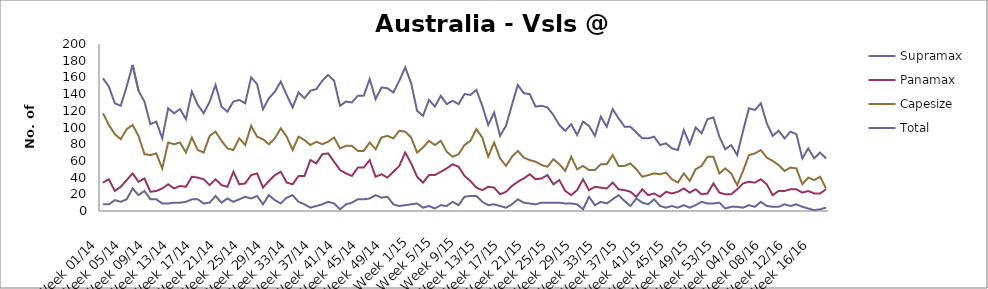
| Category | Supramax | Panamax | Capesize | Total |
|---|---|---|---|---|
| Week 01/14 | 8 | 34 | 117 | 159 |
| Week 02/14 | 8 | 38 | 103 | 149 |
| Week 03/14 | 13 | 24 | 92 | 129 |
| Week 04/14 | 11 | 29 | 86 | 126 |
| Week 05/14 | 14 | 37 | 98 | 149 |
| Week 06/14 | 27 | 45 | 103 | 175 |
| Week 07/14 | 19 | 35 | 90 | 144 |
| Week 08/14 | 24 | 39 | 68 | 131 |
| Week 09/14 | 14 | 23 | 67 | 104 |
| Week 10/14 | 14 | 24 | 69 | 107 |
| Week 11/14 | 9 | 27 | 51 | 87 |
| Week 12/14 | 9 | 32 | 82 | 123 |
| Week 13/14 | 10 | 27 | 80 | 117 |
| Week 14/14 | 10 | 30 | 82 | 122 |
| Week 15/14 | 11 | 29 | 70 | 110 |
| Week 16/14 | 14 | 41 | 88 | 143 |
| Week 17/14 | 14 | 40 | 73 | 127 |
| Week 18/14 | 9 | 38 | 70 | 117 |
| Week 19/14 | 10 | 31 | 90 | 131 |
| Week 20/14 | 18 | 38 | 95 | 151 |
| Week 21/14 | 10 | 31 | 84 | 125 |
| Week 22/14 | 15 | 29 | 75 | 119 |
| Week 23/14 | 11 | 47 | 73 | 131 |
| Week 24/14 | 14 | 32 | 87 | 133 |
| Week 25/14 | 17 | 33 | 79 | 129 |
| Week 26/14 | 15 | 43 | 102 | 160 |
| Week 27/14 | 18 | 45 | 89 | 152 |
| Week 28/14 | 8 | 28 | 86 | 122 |
| Week 29/14 | 19 | 36 | 80 | 135 |
| Week 30/14 | 13 | 43 | 87 | 143 |
| Week 31/14 | 9 | 47 | 99 | 155 |
| Week 32/14 | 16 | 34 | 89 | 139 |
| Week 33/14 | 19 | 32 | 73 | 124 |
| Week 34/14 | 11 | 42 | 89 | 142 |
| Week 35/14 | 8 | 42 | 85 | 135 |
| Week 36/14 | 4 | 61 | 79 | 144 |
| Week 37/14 | 6 | 57 | 83 | 146 |
| Week 38/14 | 8 | 68 | 80 | 156 |
| Week 39/14 | 11 | 69 | 83 | 163 |
| Week 40/14 | 9 | 59 | 88 | 156 |
| Week 41/14 | 2 | 49 | 75 | 126 |
| Week 42/14 | 8 | 45 | 78 | 131 |
| Week 43/14 | 10 | 42 | 78 | 130 |
| Week 44/14 | 14 | 52 | 72 | 138 |
| Week 45/14 | 14 | 52 | 72 | 138 |
| Week 46/14 | 15 | 61 | 82 | 158 |
| Week 47/14 | 19 | 41 | 74 | 134 |
| Week 48/14 | 16 | 44 | 88 | 148 |
| Week 49/14 | 17 | 40 | 90 | 147 |
| Week 50/14 | 8 | 47 | 87 | 142 |
| Week 51/14 | 6 | 54 | 96 | 156 |
| Week 52/14 | 7 | 70 | 95 | 172 |
| Week 1/15 | 8 | 57 | 88 | 153 |
| Week 2/15 | 9 | 41 | 70 | 120 |
| Week 3/15 | 4 | 34 | 76 | 114 |
| Week 4/15 | 6 | 43 | 84 | 133 |
| Week 5/15 | 3 | 43 | 79 | 125 |
| Week 6/15 | 7 | 47 | 84 | 138 |
| Week 7/15 | 6 | 51 | 71 | 128 |
| Week 8/15 | 11 | 56 | 65 | 132 |
| Week 9/15 | 7 | 53 | 68 | 128 |
| Week 10/15 | 17 | 42 | 79 | 140 |
| Week 11/15 | 18 | 36 | 84 | 139 |
| Week 12/15 | 18 | 28 | 98 | 145 |
| Week 13/15 | 11 | 25 | 88 | 126 |
| Week 14/15 | 7 | 29 | 65 | 103 |
| Week 15/15 | 8 | 28 | 82 | 118 |
| Week 16/15 | 6 | 20 | 63 | 90 |
| Week 17/15 | 4 | 23 | 54 | 102 |
| Week 18/15 | 8 | 30 | 65 | 127 |
| Week 19/15 | 14 | 35 | 72 | 151 |
| Week 20/15 | 10 | 39 | 64 | 141 |
| Week 21/15 | 9 | 44 | 61 | 140 |
| Week 22/15 | 8 | 38 | 59 | 125 |
| Week 23/15 | 10 | 39 | 55 | 126 |
| Week 24/15 | 10 | 43 | 53 | 124 |
| Week 25/15 | 10 | 32 | 62 | 115 |
| Week 26/15 | 10 | 37 | 56 | 103 |
| Week 27/15 | 9 | 24 | 48 | 96 |
| Week 28/15 | 9 | 19 | 65 | 104 |
| Week 29/15 | 8 | 25 | 50 | 91 |
| Week 30/15 | 2 | 38 | 54 | 107 |
| Week 31/15 | 17 | 25 | 49 | 102 |
| Week 32/15 | 7 | 29 | 49 | 90 |
| Week 33/15 | 11 | 28 | 56 | 113 |
| Week 34/15 | 9 | 27 | 56 | 101 |
| Week 35/15 | 14 | 34 | 67 | 122 |
| Week 36/15 | 19 | 26 | 54 | 111 |
| Week 37/15 | 12 | 25 | 54 | 101 |
| Week 38/15 | 6 | 23 | 57 | 101 |
| Week 39/15 | 15 | 17 | 50 | 94 |
| Week 40/15 | 10 | 26 | 41 | 87 |
| Week 41/15 | 8 | 19 | 43 | 87 |
| Week 42/15 | 14 | 21 | 45 | 89 |
| Week 43/15 | 6 | 17 | 44 | 79 |
| Week 44/15 | 4 | 23 | 46 | 81 |
| Week 45/15 | 6 | 21 | 38 | 75 |
| Week 46/15 | 4 | 23 | 34 | 73 |
| Week 47/15 | 7 | 27 | 45 | 97 |
| Week 48/15 | 4 | 22 | 36 | 80 |
| Week 49/15 | 7 | 26 | 50 | 100 |
| Week 50/15 | 11 | 20 | 54 | 93 |
| Week 51/15 | 9 | 21 | 65 | 110 |
| Week 52/15 | 9 | 33 | 65 | 112 |
| Week 53/15 | 10 | 22 | 45 | 89 |
| Week 01/16 | 3 | 20 | 51 | 74 |
| Week 02/16 | 5 | 20 | 45 | 79 |
| Week 03/16 | 5 | 26 | 31 | 67 |
| Week 04/16 | 4 | 33 | 48 | 96 |
| Week 05/16 | 7 | 35 | 67 | 123 |
| Week 06/16 | 5 | 34 | 69 | 121 |
| Week 07/16 | 11 | 38 | 73 | 129 |
| Week 08/16 | 6 | 32 | 64 | 105 |
| Week 09/16 | 5 | 19 | 60 | 90 |
| Week 10/16 | 5 | 24 | 55 | 96 |
| Week 11/16 | 8 | 24 | 48 | 87 |
| Week 12/16 | 6 | 26 | 52 | 95 |
| Week 13/16 | 8 | 26 | 51 | 92 |
| Week 14/16 | 5 | 22 | 32 | 63 |
| Week 15/16 | 3 | 24 | 40 | 75 |
| Week 16/16 | 1 | 21 | 37 | 63 |
| Week 17/16 | 2 | 21 | 41 | 70 |
| Week 18/16 | 4 | 26 | 27 | 63 |